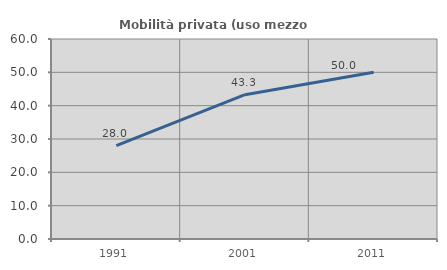
| Category | Mobilità privata (uso mezzo privato) |
|---|---|
| 1991.0 | 28 |
| 2001.0 | 43.301 |
| 2011.0 | 50 |